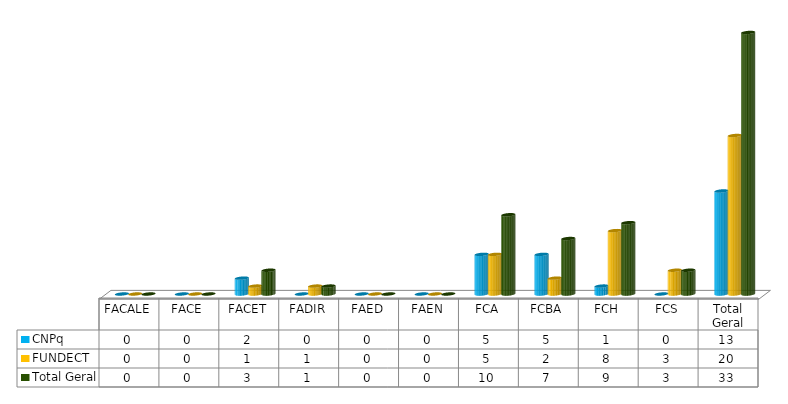
| Category | CNPq | FUNDECT | Total Geral |
|---|---|---|---|
| FACALE | 0 | 0 | 0 |
| FACE | 0 | 0 | 0 |
| FACET | 2 | 1 | 3 |
| FADIR | 0 | 1 | 1 |
| FAED | 0 | 0 | 0 |
| FAEN | 0 | 0 | 0 |
| FCA | 5 | 5 | 10 |
| FCBA | 5 | 2 | 7 |
| FCH | 1 | 8 | 9 |
| FCS | 0 | 3 | 3 |
| Total Geral | 13 | 20 | 33 |